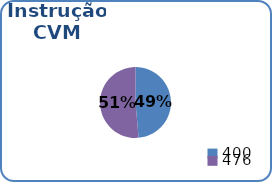
| Category | Instrução CVM |
|---|---|
| 400.0 | 35 |
| 476.0 | 37 |